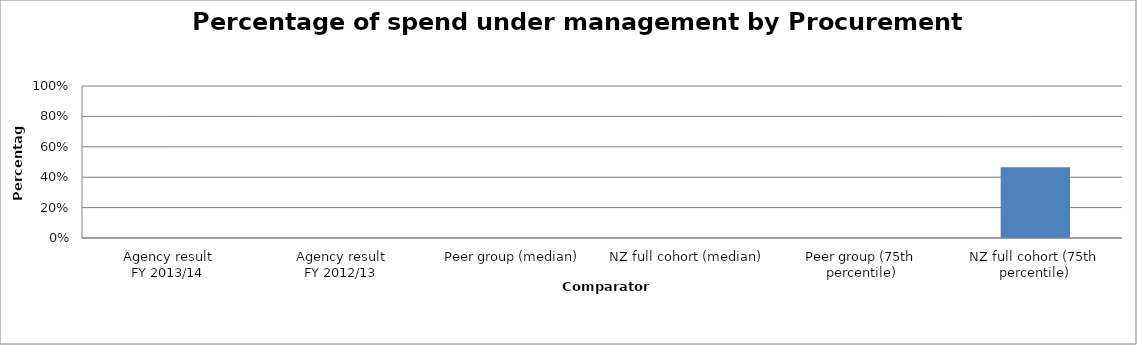
| Category | Series 0 |
|---|---|
| Agency result
FY 2013/14 | 0 |
| Agency result
FY 2012/13 | 0 |
| Peer group (median) | 0 |
| NZ full cohort (median) | 0 |
| Peer group (75th percentile) | 0 |
| NZ full cohort (75th percentile) | 0.465 |